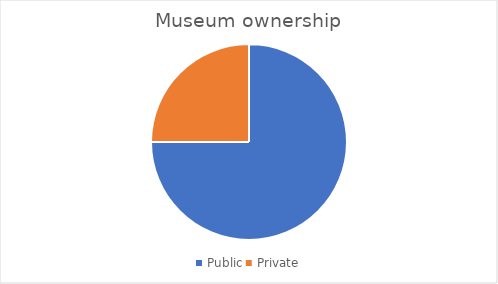
| Category | Series 0 |
|---|---|
| Public | 54 |
| Private | 18 |